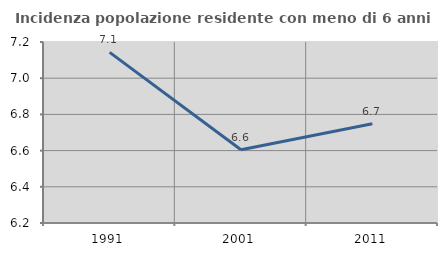
| Category | Incidenza popolazione residente con meno di 6 anni |
|---|---|
| 1991.0 | 7.143 |
| 2001.0 | 6.604 |
| 2011.0 | 6.748 |